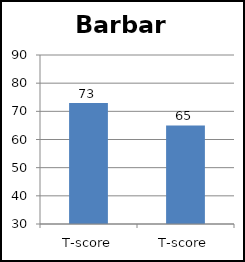
| Category | Barbara |
|---|---|
| T-score | 73 |
| T-score | 65 |